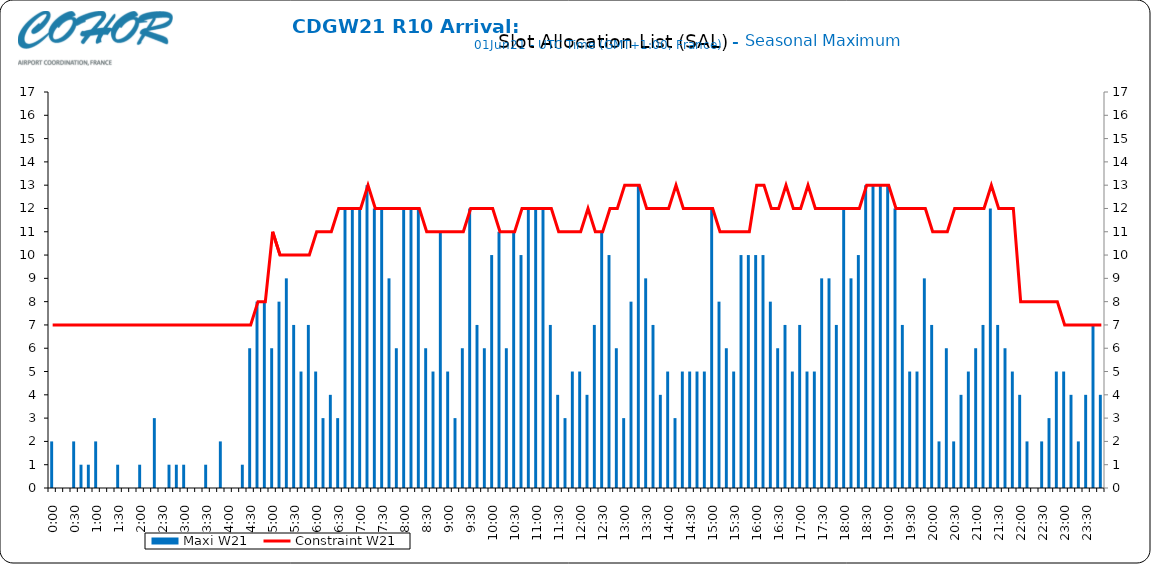
| Category | Maxi W21 |
|---|---|
| 0.0 | 2 |
| 0.006944444444444444 | 0 |
| 0.013888888888888888 | 0 |
| 0.020833333333333332 | 2 |
| 0.027777777777777776 | 1 |
| 0.034722222222222224 | 1 |
| 0.041666666666666664 | 2 |
| 0.04861111111111111 | 0 |
| 0.05555555555555555 | 0 |
| 0.0625 | 1 |
| 0.06944444444444443 | 0 |
| 0.0763888888888889 | 0 |
| 0.08333333333333333 | 1 |
| 0.09027777777777778 | 0 |
| 0.09722222222222222 | 3 |
| 0.10416666666666667 | 0 |
| 0.1111111111111111 | 1 |
| 0.11805555555555557 | 1 |
| 0.125 | 1 |
| 0.13194444444444445 | 0 |
| 0.1388888888888889 | 0 |
| 0.14583333333333334 | 1 |
| 0.15277777777777776 | 0 |
| 0.15972222222222224 | 2 |
| 0.16666666666666666 | 0 |
| 0.17361111111111113 | 0 |
| 0.18055555555555555 | 1 |
| 0.1875 | 6 |
| 0.19444444444444445 | 8 |
| 0.20138888888888887 | 8 |
| 0.20833333333333334 | 6 |
| 0.2152777777777778 | 8 |
| 0.2222222222222222 | 9 |
| 0.22916666666666666 | 7 |
| 0.23611111111111113 | 5 |
| 0.24305555555555555 | 7 |
| 0.25 | 5 |
| 0.2569444444444445 | 3 |
| 0.2638888888888889 | 4 |
| 0.2708333333333333 | 3 |
| 0.2777777777777778 | 12 |
| 0.2847222222222222 | 12 |
| 0.2916666666666667 | 12 |
| 0.2986111111111111 | 13 |
| 0.3055555555555555 | 12 |
| 0.3125 | 12 |
| 0.3194444444444445 | 9 |
| 0.3263888888888889 | 6 |
| 0.3333333333333333 | 12 |
| 0.34027777777777773 | 12 |
| 0.34722222222222227 | 12 |
| 0.3541666666666667 | 6 |
| 0.3611111111111111 | 5 |
| 0.3680555555555556 | 11 |
| 0.375 | 5 |
| 0.3819444444444444 | 3 |
| 0.3888888888888889 | 6 |
| 0.3958333333333333 | 12 |
| 0.40277777777777773 | 7 |
| 0.40972222222222227 | 6 |
| 0.4166666666666667 | 10 |
| 0.4236111111111111 | 11 |
| 0.4305555555555556 | 6 |
| 0.4375 | 11 |
| 0.4444444444444444 | 10 |
| 0.4513888888888889 | 12 |
| 0.4583333333333333 | 12 |
| 0.46527777777777773 | 12 |
| 0.47222222222222227 | 7 |
| 0.4791666666666667 | 4 |
| 0.4861111111111111 | 3 |
| 0.4930555555555556 | 5 |
| 0.5 | 5 |
| 0.5069444444444444 | 4 |
| 0.513888888888889 | 7 |
| 0.5208333333333334 | 11 |
| 0.5277777777777778 | 10 |
| 0.5347222222222222 | 6 |
| 0.5416666666666666 | 3 |
| 0.548611111111111 | 8 |
| 0.5555555555555556 | 13 |
| 0.5625 | 9 |
| 0.5694444444444444 | 7 |
| 0.576388888888889 | 4 |
| 0.5833333333333334 | 5 |
| 0.5902777777777778 | 3 |
| 0.5972222222222222 | 5 |
| 0.6041666666666666 | 5 |
| 0.611111111111111 | 5 |
| 0.6180555555555556 | 5 |
| 0.625 | 12 |
| 0.6319444444444444 | 8 |
| 0.638888888888889 | 6 |
| 0.6458333333333334 | 5 |
| 0.6527777777777778 | 10 |
| 0.6597222222222222 | 10 |
| 0.6666666666666666 | 10 |
| 0.6736111111111112 | 10 |
| 0.6805555555555555 | 8 |
| 0.6875 | 6 |
| 0.6944444444444445 | 7 |
| 0.7013888888888888 | 5 |
| 0.7083333333333334 | 7 |
| 0.7152777777777778 | 5 |
| 0.7222222222222222 | 5 |
| 0.7291666666666666 | 9 |
| 0.7361111111111112 | 9 |
| 0.7430555555555555 | 7 |
| 0.75 | 12 |
| 0.7569444444444445 | 9 |
| 0.7638888888888888 | 10 |
| 0.7708333333333334 | 13 |
| 0.7777777777777778 | 13 |
| 0.7847222222222222 | 13 |
| 0.7916666666666666 | 13 |
| 0.7986111111111112 | 12 |
| 0.8055555555555555 | 7 |
| 0.8125 | 5 |
| 0.8194444444444445 | 5 |
| 0.8263888888888888 | 9 |
| 0.8333333333333334 | 7 |
| 0.8402777777777778 | 2 |
| 0.8472222222222222 | 6 |
| 0.8541666666666666 | 2 |
| 0.8611111111111112 | 4 |
| 0.8680555555555555 | 5 |
| 0.875 | 6 |
| 0.8819444444444445 | 7 |
| 0.8888888888888888 | 12 |
| 0.8958333333333334 | 7 |
| 0.9027777777777778 | 6 |
| 0.9097222222222222 | 5 |
| 0.9166666666666666 | 4 |
| 0.9236111111111112 | 2 |
| 0.9305555555555555 | 0 |
| 0.9375 | 2 |
| 0.9444444444444445 | 3 |
| 0.9513888888888888 | 5 |
| 0.9583333333333334 | 5 |
| 0.9652777777777778 | 4 |
| 0.9722222222222222 | 2 |
| 0.9791666666666666 | 4 |
| 0.9861111111111112 | 7 |
| 0.9930555555555555 | 4 |